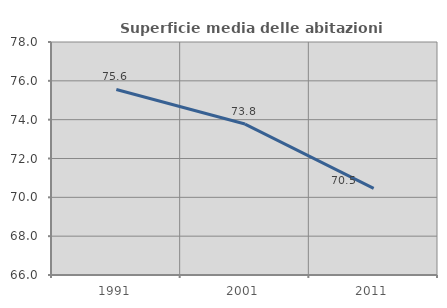
| Category | Superficie media delle abitazioni occupate |
|---|---|
| 1991.0 | 75.554 |
| 2001.0 | 73.774 |
| 2011.0 | 70.459 |